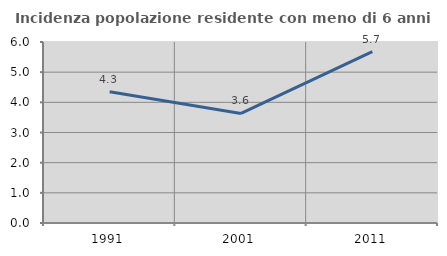
| Category | Incidenza popolazione residente con meno di 6 anni |
|---|---|
| 1991.0 | 4.348 |
| 2001.0 | 3.631 |
| 2011.0 | 5.679 |